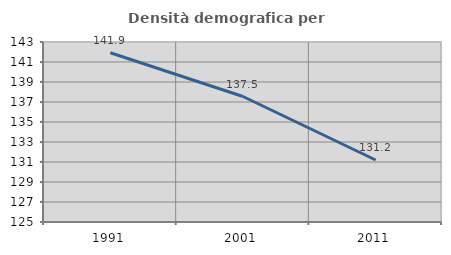
| Category | Densità demografica |
|---|---|
| 1991.0 | 141.924 |
| 2001.0 | 137.548 |
| 2011.0 | 131.202 |